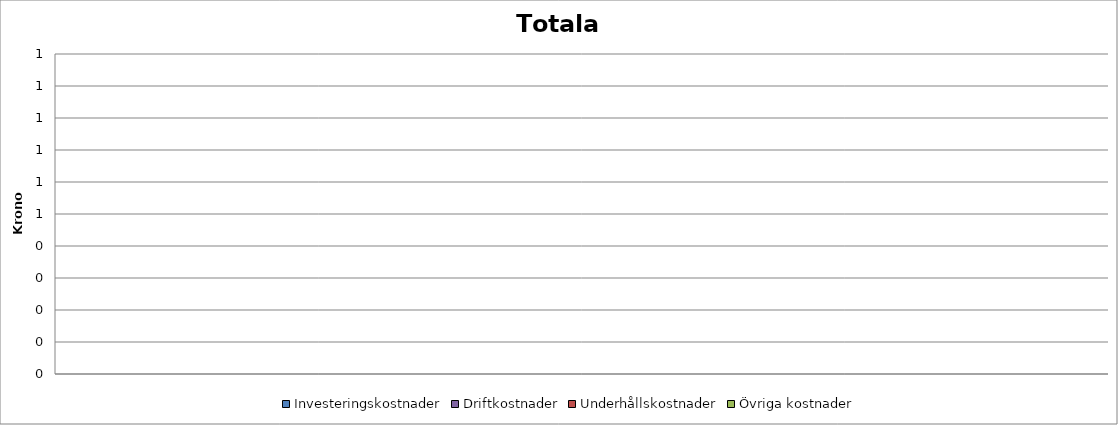
| Category | Investeringskostnader | Driftkostnader | Underhållskostnader | Övriga kostnader |
|---|---|---|---|---|
| 0 | 0 | 0 | 0 | 0 |
| 1 | 0 | 0 | 0 | 0 |
| 2 | 0 | 0 | 0 | 0 |
| 3 | 0 | 0 | 0 | 0 |
| 4 | 0 | 0 | 0 | 0 |